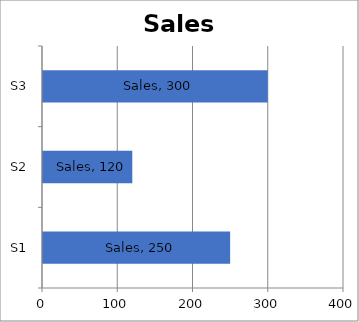
| Category | Sales |
|---|---|
| S1 | 250 |
| S2 | 120 |
| S3 | 300 |